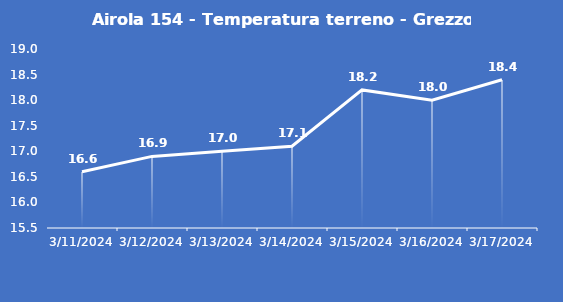
| Category | Airola 154 - Temperatura terreno - Grezzo (°C) |
|---|---|
| 3/11/24 | 16.6 |
| 3/12/24 | 16.9 |
| 3/13/24 | 17 |
| 3/14/24 | 17.1 |
| 3/15/24 | 18.2 |
| 3/16/24 | 18 |
| 3/17/24 | 18.4 |